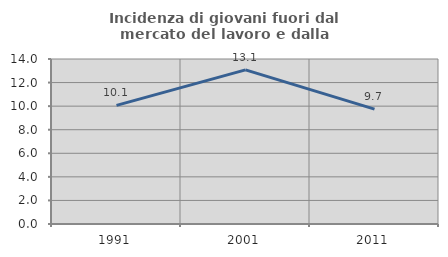
| Category | Incidenza di giovani fuori dal mercato del lavoro e dalla formazione  |
|---|---|
| 1991.0 | 10.061 |
| 2001.0 | 13.08 |
| 2011.0 | 9.746 |